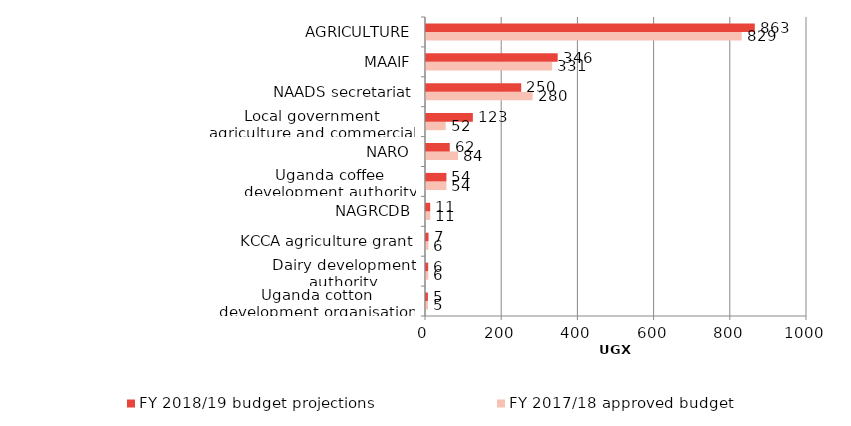
| Category | FY 2017/18 approved budget | FY 2018/19 budget projections |
|---|---|---|
| Uganda cotton development organisation | 5.08 | 4.99 |
| Dairy development authority | 5.97 | 5.74 |
| KCCA agriculture grant | 6.36 | 6.66 |
| NAGRCDB | 11.16 | 11 |
| Uganda coffee development authority | 53.59 | 53.59 |
| NARO | 84.1 | 62.35 |
| Local government agriculture and commercial Services | 51.62 | 122.97 |
| NAADS secretariat | 279.7 | 249.98 |
| MAAIF | 330.94 | 345.65 |
| AGRICULTURE | 828.52 | 862.93 |